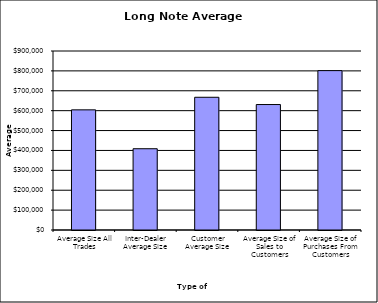
| Category | Security Type |
|---|---|
| Average Size All Trades | 604120.426 |
| Inter-Dealer Average Size | 408672.978 |
| Customer Average Size | 667352.296 |
| Average Size of Sales to Customers | 630803.748 |
| Average Size of Purchases From Customers | 801397.107 |